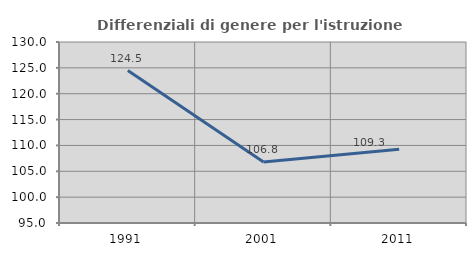
| Category | Differenziali di genere per l'istruzione superiore |
|---|---|
| 1991.0 | 124.487 |
| 2001.0 | 106.818 |
| 2011.0 | 109.277 |